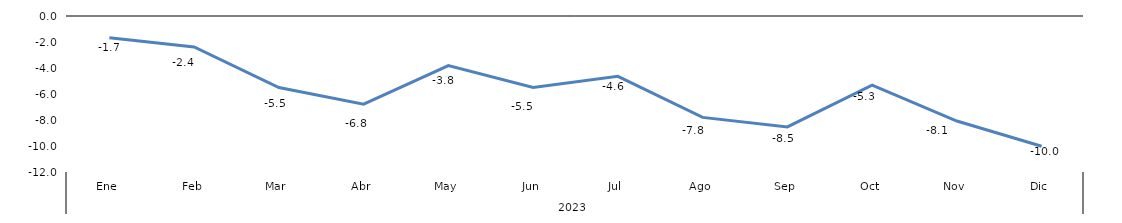
| Category | Series 0 |
|---|---|
| 0 | -1.667 |
| 1 | -2.385 |
| 2 | -5.499 |
| 3 | -6.782 |
| 4 | -3.813 |
| 5 | -5.504 |
| 6 | -4.641 |
| 7 | -7.799 |
| 8 | -8.536 |
| 9 | -5.311 |
| 10 | -8.078 |
| 11 | -10.017 |